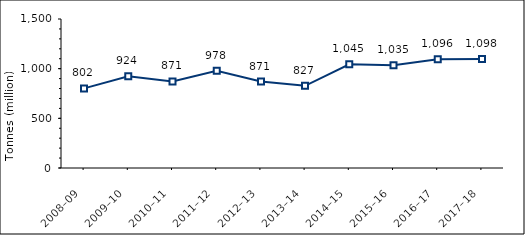
| Category | Total organics |
|---|---|
| 2008–09 | 801560 |
| 2009–10 | 924429 |
| 2010–11 | 870878 |
| 2011–12 | 977951 |
| 2012–13 | 870775 |
| 2013–14 | 827160 |
| 2014–15 | 1044651 |
| 2015–16 | 1035354 |
| 2016–17 | 1095832 |
| 2017–18 | 1098205 |